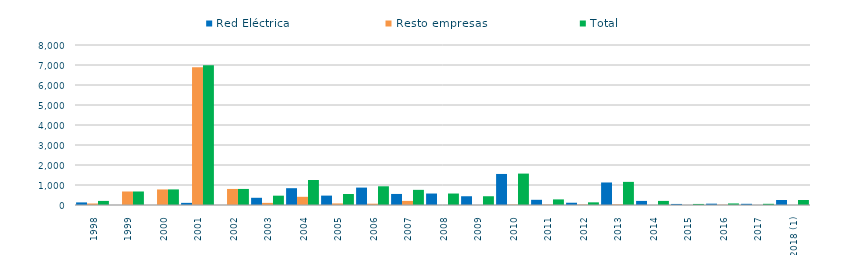
| Category | Red Eléctrica | Resto empresas | Total |
|---|---|---|---|
| 1998 | 129.6 | 74.9 | 204.5 |
| 1999 | 0.46 | 675.17 | 675.63 |
| 2000 | 1.4 | 777.91 | 779.31 |
| 2001 | 107.04 | 6883.28 | 6990.32 |
| 2002 | 0.1 | 802.59 | 802.69 |
| 2003 | 360.4 | 105.83 | 466.23 |
| 2004 | 840.46 | 409.19 | 1249.65 |
| 2005 | 469.56 | 79.23 | 548.79 |
| 2006 | 870.41 | 65.39 | 935.8 |
| 2007 | 552.37 | 204.778 | 757.16 |
| 2008 | 573.542 | 0 | 573.542 |
| 2009 | 437.499 | 0 | 437.499 |
| 2010 | 1552.05 | 18.49 | 1570.54 |
| 2011 | 259.46 | 20.23 | 279.69 |
| 2012 | 113.47 | 19.29 | 132.77 |
| 2013 | 1126 | 30.18 | 1156.18 |
| 2014 | 204.34 | 0 | 204.34 |
| 2015 | 52.77 | 0 | 52.77 |
| 2016 | 66.945 | 11.025 | 77.97 |
| 2017 | 60.153 | 0 | 60.153 |
| 2018 (1) | 250.127 | 0 | 250.127 |